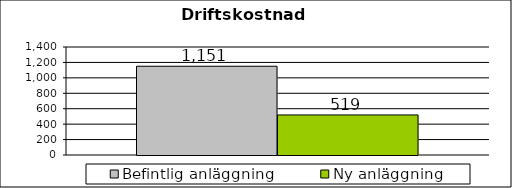
| Category | Befintlig anläggning | Ny anläggning |
|---|---|---|
| 0 | 1150.644 | 519.156 |